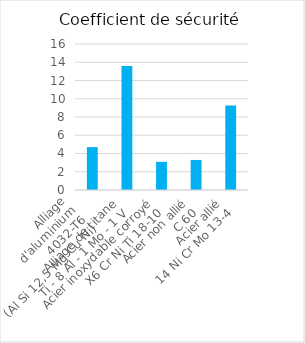
| Category | Alliage
d'aluminium
4032-T6
(Al Si 12,5 Mg Cu Ni) |
|---|---|
| Alliage
d'aluminium
4032-T6
(Al Si 12,5 Mg Cu Ni) | 4.701 |
| Alliage de titane
Ti - 8 Al - 1 Mo - 1 V | 13.582 |
| Acier inoxydable corroyé
X6 Cr Ni Ti 18-10 | 3.087 |
| Acier non allié
C 60 | 3.292 |
| Acier allié
14 Ni Cr Mo 13-4 | 9.26 |